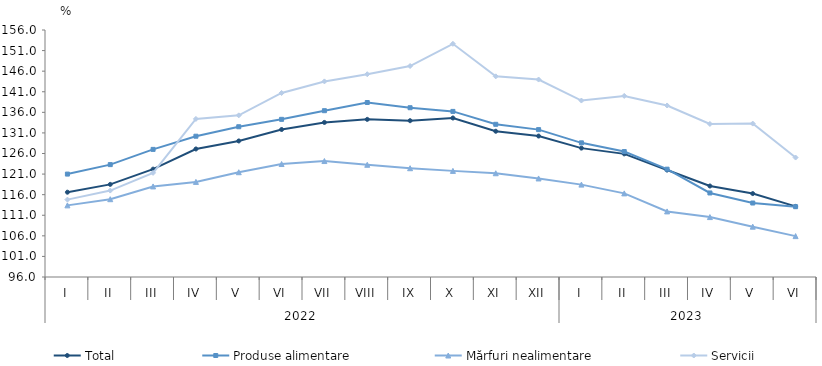
| Category | Total  | Produse alimentare | Mărfuri nealimentare  | Servicii |
|---|---|---|---|---|
| 0 | 116.6 | 121 | 113.4 | 114.8 |
| 1 | 118.5 | 123.3 | 114.9 | 117 |
| 2 | 122.2 | 127 | 118 | 121.3 |
| 3 | 127.1 | 130.2 | 119.1 | 134.4 |
| 4 | 129.047 | 132.5 | 121.45 | 135.267 |
| 5 | 131.827 | 134.301 | 123.443 | 140.701 |
| 6 | 133.547 | 136.399 | 124.168 | 143.511 |
| 7 | 134.294 | 138.387 | 123.256 | 145.253 |
| 8 | 133.971 | 137.121 | 122.424 | 147.248 |
| 9 | 134.625 | 136.226 | 121.779 | 152.646 |
| 10 | 131.406 | 133.093 | 121.201 | 144.742 |
| 11 | 130.241 | 131.801 | 119.936 | 143.965 |
| 12 | 127.307 | 128.59 | 118.441 | 138.865 |
| 13 | 125.91 | 126.47 | 116.31 | 139.99 |
| 14 | 121.977 | 122.19 | 111.932 | 137.666 |
| 15 | 118.102 | 116.414 | 110.554 | 133.178 |
| 16 | 116.262 | 113.97 | 108.228 | 133.268 |
| 17 | 113.152 | 113.076 | 105.931 | 125.017 |